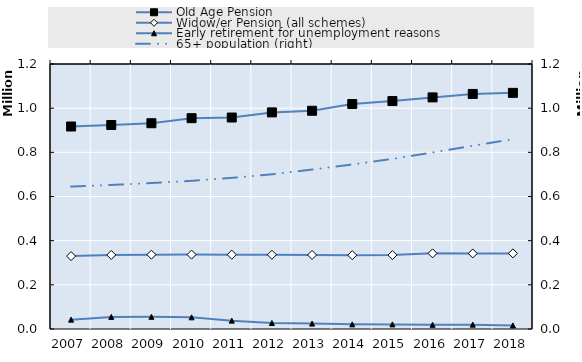
| Category | Old Age Pension | Widow/er Pension (all schemes) | Series 4 | Series 5 | Series 6 | Series 7 | Series 8 | Series 9 | Series 10 | Series 11 | Series 12 | Series 13 | Series 14 | Series 15 | Series 16 | Series 17 | Series 18 | Series 19 |
|---|---|---|---|---|---|---|---|---|---|---|---|---|---|---|---|---|---|---|
| 2007.0 | 916943 | 330108.417 |  |  |  |  |  |  |  |  |  |  |  |  |  |  |  |  |
| 2008.0 | 923734 | 335167.083 |  |  |  |  |  |  |  |  |  |  |  |  |  |  |  |  |
| 2009.0 | 931794 | 336510 |  |  |  |  |  |  |  |  |  |  |  |  |  |  |  |  |
| 2010.0 | 954661 | 336830.583 |  |  |  |  |  |  |  |  |  |  |  |  |  |  |  |  |
| 2011.0 | 957633 | 336638.75 |  |  |  |  |  |  |  |  |  |  |  |  |  |  |  |  |
| 2012.0 | 980864 | 336150.5 |  |  |  |  |  |  |  |  |  |  |  |  |  |  |  |  |
| 2013.0 | 988278 | 335335.917 |  |  |  |  |  |  |  |  |  |  |  |  |  |  |  |  |
| 2014.0 | 1018815 | 334325.667 |  |  |  |  |  |  |  |  |  |  |  |  |  |  |  |  |
| 2015.0 | 1032197 | 334547 |  |  |  |  |  |  |  |  |  |  |  |  |  |  |  |  |
| 2016.0 | 1048842 | 342528 |  |  |  |  |  |  |  |  |  |  |  |  |  |  |  |  |
| 2017.0 | 1064393 | 342061 |  |  |  |  |  |  |  |  |  |  |  |  |  |  |  |  |
| 2018.0 | 1069255 | 342401 |  |  |  |  |  |  |  |  |  |  |  |  |  |  |  |  |